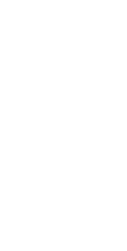
| Category | Budget | Actual |
|---|---|---|
| TO SAVINGS (0%) | 0 | 0 |
| CHARITY / GIFTS (0%) | 0 | 0 |
| HOUSING (0%) | 0 | 0 |
| UTILITIES (0%) | 0 | 0 |
| FOOD (0%) | 0 | 0 |
| TRANSPORTATION (0%) | 0 | 0 |
| HEALTH (0%) | 0 | 0 |
| DAILY LIVING (0%) | 0 | 0 |
| CHILDREN (0%) | 0 | 0 |
| OBLIGATIONS (0%) | 0 | 0 |
| BUSINESS EXPENSE (0%) | 0 | 0 |
| ENTERTAINMENT (0%) | 0 | 0 |
| SUBSCRIPTIONS (0%) | 0 | 0 |
| MISCELLANEOUS (0%) | 0 | 0 |